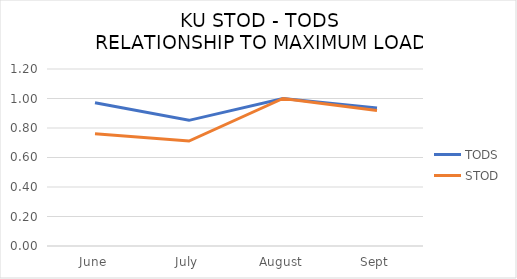
| Category | TODS | STOD |
|---|---|---|
| June | 0.972 | 0.761 |
| July | 0.852 | 0.711 |
| August | 1 | 1 |
| Sept | 0.936 | 0.919 |